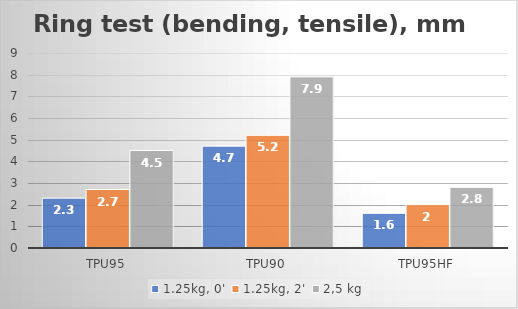
| Category | 1.25kg, 0' | 1.25kg, 2' | 2,5 kg |
|---|---|---|---|
| TPU95 | 2.3 | 2.7 | 4.5 |
| TPU90 | 4.7 | 5.2 | 7.9 |
| TPU95HF | 1.6 | 2 | 2.8 |